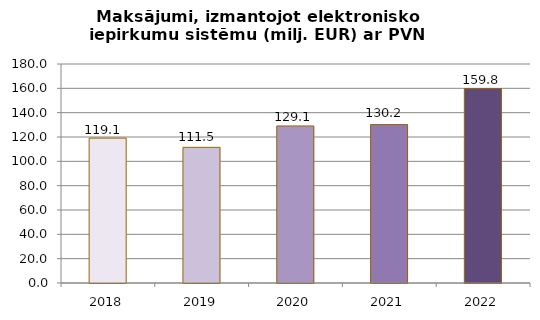
| Category | Maksājumi, izmantojot elektronisko iepirkumu sistēmu (milj. EUR) ar PVN |
|---|---|
| 2018.0 | 119.077 |
| 2019.0 | 111.503 |
| 2020.0 | 129.092 |
| 2021.0 | 130.214 |
| 2022.0 | 159.842 |